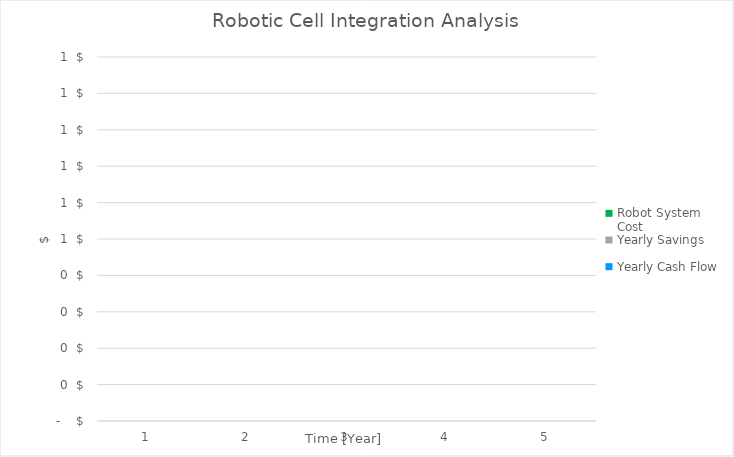
| Category | Robot System Cost | Yearly Savings | Yearly Cash Flow |
|---|---|---|---|
| 0 | 0 | 0 | 0 |
| 1 | 0 | 0 | 0 |
| 2 | 0 | 0 | 0 |
| 3 | 0 | 0 | 0 |
| 4 | 0 | 0 | 0 |